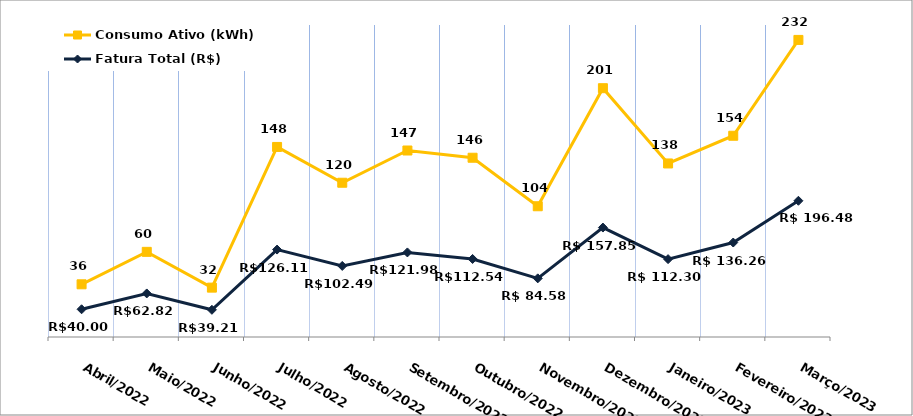
| Category | Fatura Total (R$) | Consumo Ativo (kWh) |
|---|---|---|
| Abril/2022 | 40 | 36 |
| Maio/2022 | 62.82 | 60 |
| Junho/2022 | 39.21 | 32 |
| Julho/2022 | 126.11 | 148 |
| Agosto/2022 | 102.49 | 120 |
| Setembro/2022 | 121.98 | 147 |
| Outubro/2022 | 112.54 | 146 |
| Novembro/2022 | 84.58 | 104 |
| Dezembro/2022 | 157.85 | 201 |
| Janeiro/2023 | 112.3 | 138 |
| Fevereiro/2023 | 136.26 | 154 |
| Março/2023 | 196.48 | 232 |